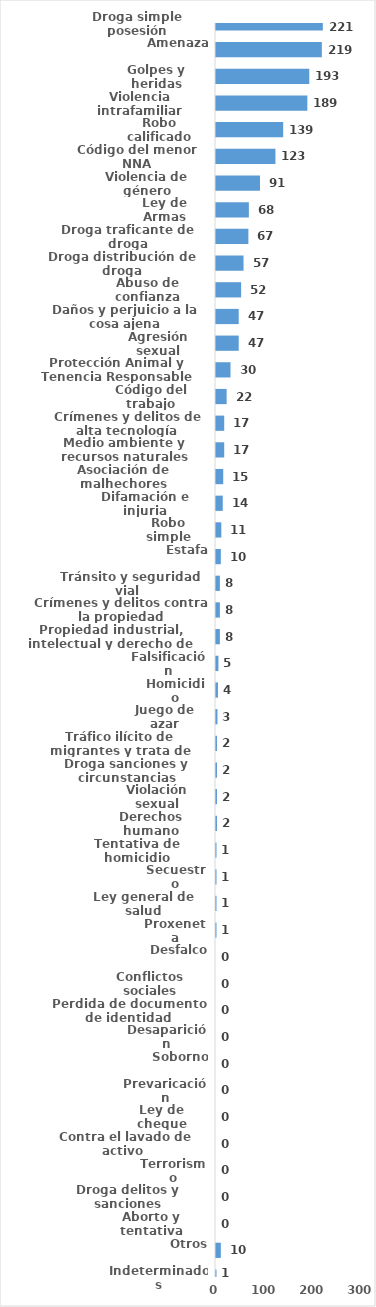
| Category | Series 0 |
|---|---|
| Droga simple posesión | 221 |
| Amenaza | 219 |
| Golpes y heridas | 193 |
| Violencia intrafamiliar | 189 |
| Robo calificado | 139 |
| Código del menor NNA | 123 |
| Violencia de género | 91 |
| Ley de Armas | 68 |
| Droga traficante de droga | 67 |
| Droga distribución de droga | 57 |
| Abuso de confianza | 52 |
| Daños y perjuicio a la cosa ajena | 47 |
| Agresión sexual | 47 |
| Protección Animal y Tenencia Responsable | 30 |
| Código del trabajo | 22 |
| Crímenes y delitos de alta tecnología | 17 |
| Medio ambiente y recursos naturales | 17 |
| Asociación de malhechores | 15 |
| Difamación e injuria | 14 |
| Robo simple | 11 |
| Estafa | 10 |
| Tránsito y seguridad vial  | 8 |
| Crímenes y delitos contra la propiedad | 8 |
| Propiedad industrial, intelectual y derecho de autor | 8 |
| Falsificación | 5 |
| Homicidio | 4 |
| Juego de azar | 3 |
| Tráfico ilícito de migrantes y trata de personas | 2 |
| Droga sanciones y circunstancias agravantes | 2 |
| Violación sexual | 2 |
| Derechos humano | 2 |
| Tentativa de homicidio | 1 |
| Secuestro | 1 |
| Ley general de salud | 1 |
| Proxeneta | 1 |
| Desfalco | 0 |
| Conflictos sociales | 0 |
| Perdida de documento de identidad | 0 |
| Desaparición | 0 |
| Soborno | 0 |
| Prevaricación | 0 |
| Ley de cheque | 0 |
| Contra el lavado de activo  | 0 |
| Terrorismo | 0 |
| Droga delitos y sanciones | 0 |
| Aborto y tentativa | 0 |
| Otros | 10 |
| Indeterminados | 1 |